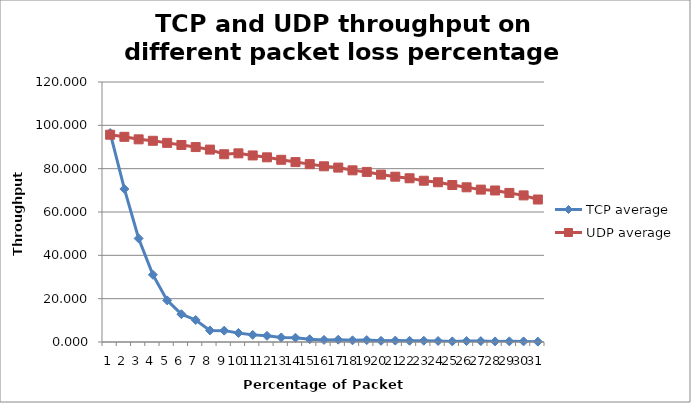
| Category | TCP average | UDP average |
|---|---|---|
| 0 | 96.467 | 95.667 |
| 1 | 70.633 | 94.7 |
| 2 | 47.8 | 93.533 |
| 3 | 31.033 | 92.867 |
| 4 | 19.2 | 91.9 |
| 5 | 12.833 | 90.933 |
| 6 | 10.167 | 89.967 |
| 7 | 5.33 | 88.8 |
| 8 | 5.247 | 86.667 |
| 9 | 4.173 | 87.067 |
| 10 | 3.287 | 86.1 |
| 11 | 2.863 | 85.233 |
| 12 | 2.11 | 84.1 |
| 13 | 1.963 | 83.033 |
| 14 | 1.273 | 82.1 |
| 15 | 0.971 | 81.1 |
| 16 | 1.054 | 80.5 |
| 17 | 0.785 | 79.233 |
| 18 | 0.878 | 78.5 |
| 19 | 0.54 | 77.267 |
| 20 | 0.638 | 76.3 |
| 21 | 0.564 | 75.567 |
| 22 | 0.577 | 74.433 |
| 23 | 0.466 | 73.733 |
| 24 | 0.285 | 72.467 |
| 25 | 0.436 | 71.4 |
| 26 | 0.41 | 70.333 |
| 27 | 0.268 | 69.933 |
| 28 | 0.293 | 68.8 |
| 29 | 0.285 | 67.667 |
| 30 | 0.17 | 65.767 |